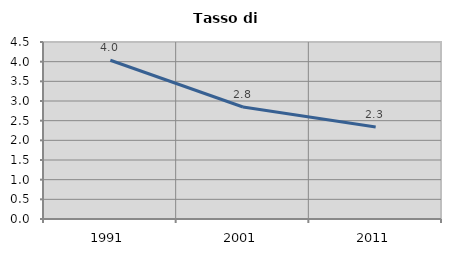
| Category | Tasso di disoccupazione   |
|---|---|
| 1991.0 | 4.037 |
| 2001.0 | 2.847 |
| 2011.0 | 2.338 |